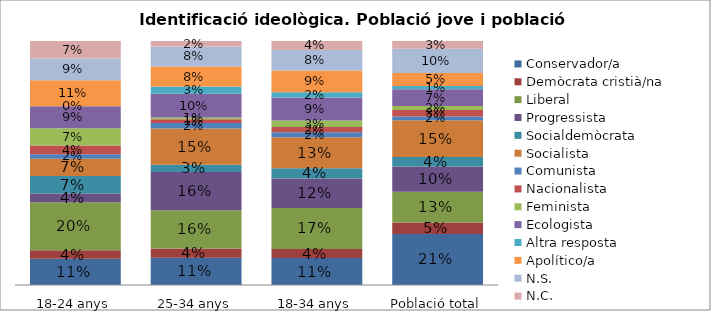
| Category | Conservador/a | Demòcrata cristià/na | Liberal | Progressista | Socialdemòcrata | Socialista | Comunista | Nacionalista | Feminista | Ecologista | Altra resposta | Apolítico/a | N.S. | N.C. |
|---|---|---|---|---|---|---|---|---|---|---|---|---|---|---|
| 18-24 anys | 0.107 | 0.036 | 0.196 | 0.036 | 0.071 | 0.071 | 0.018 | 0.036 | 0.071 | 0.089 | 0 | 0.107 | 0.089 | 0.071 |
| 25-34 anys | 0.112 | 0.037 | 0.157 | 0.157 | 0.03 | 0.149 | 0.022 | 0.015 | 0.007 | 0.097 | 0.03 | 0.082 | 0.082 | 0.022 |
| 18-34 anys | 0.111 | 0.037 | 0.168 | 0.121 | 0.042 | 0.126 | 0.021 | 0.021 | 0.026 | 0.095 | 0.021 | 0.089 | 0.084 | 0.037 |
| Població total | 0.209 | 0.047 | 0.126 | 0.104 | 0.039 | 0.151 | 0.015 | 0.027 | 0.017 | 0.069 | 0.013 | 0.054 | 0.099 | 0.032 |